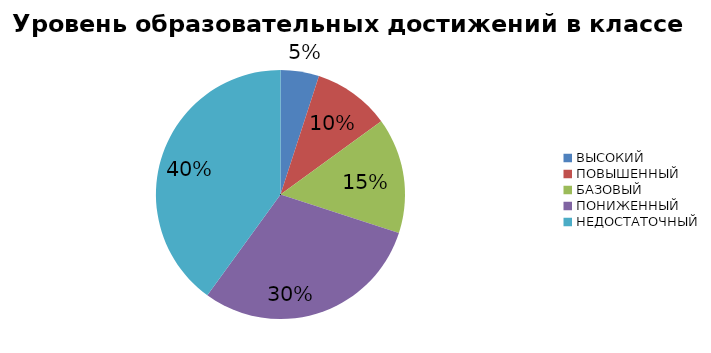
| Category | Series 0 |
|---|---|
| ВЫСОКИЙ | 5 |
| ПОВЫШЕННЫЙ | 10 |
| БАЗОВЫЙ | 15 |
| ПОНИЖЕННЫЙ | 30 |
| НЕДОСТАТОЧНЫЙ | 40 |